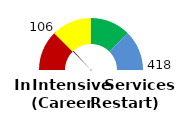
| Category | Series 1 |
|---|---|
| 0 | 25.359 |
| 1 | 1 |
| 2 | 173.641 |